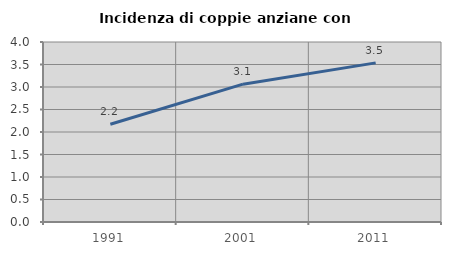
| Category | Incidenza di coppie anziane con figli |
|---|---|
| 1991.0 | 2.171 |
| 2001.0 | 3.063 |
| 2011.0 | 3.536 |